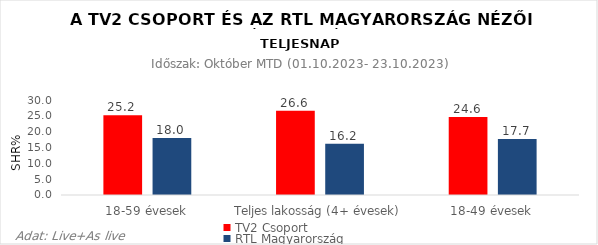
| Category | TV2 Csoport | RTL Magyarország |
|---|---|---|
| 18-59 évesek | 25.2 | 18 |
| Teljes lakosság (4+ évesek) | 26.6 | 16.2 |
| 18-49 évesek | 24.6 | 17.7 |